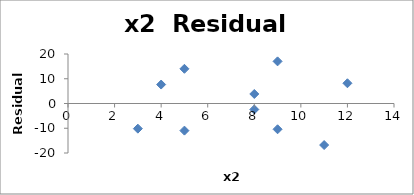
| Category | Series 0 |
|---|---|
| 3.0 | -10.163 |
| 9.0 | -10.412 |
| 4.0 | 7.655 |
| 8.0 | -2.412 |
| 9.0 | 17.025 |
| 12.0 | 8.18 |
| 5.0 | 14.019 |
| 11.0 | -16.781 |
| 8.0 | 3.848 |
| 5.0 | -10.958 |